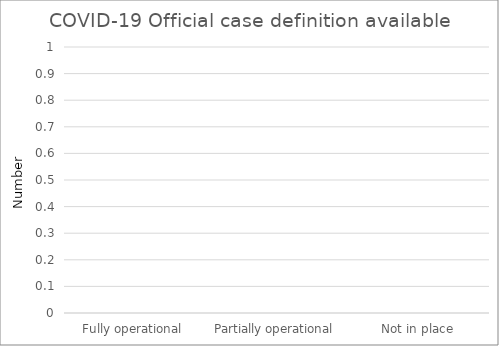
| Category | COVID-19 Official case definition available |
|---|---|
| Fully operational | 0 |
| Partially operational | 0 |
| Not in place | 0 |